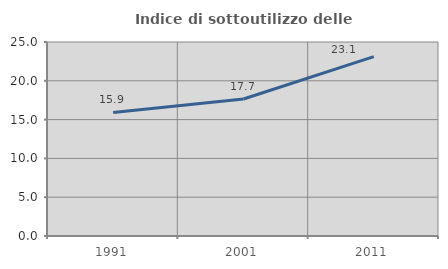
| Category | Indice di sottoutilizzo delle abitazioni  |
|---|---|
| 1991.0 | 15.928 |
| 2001.0 | 17.653 |
| 2011.0 | 23.112 |